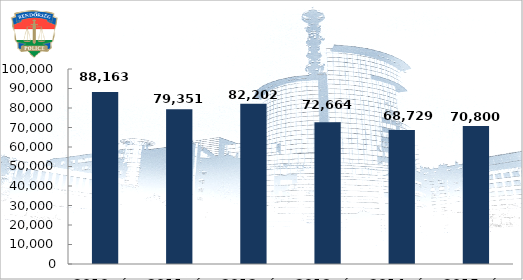
| Category | Közterületi szolgálati óraszám (óra) |
|---|---|
| 2010. év | 88163 |
| 2011. év | 79351 |
| 2012. év | 82202 |
| 2013. év | 72664 |
| 2014. év | 68729 |
| 2015. év | 70800 |